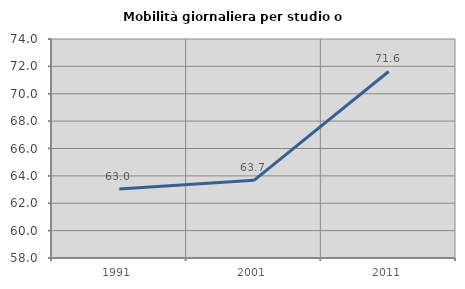
| Category | Mobilità giornaliera per studio o lavoro |
|---|---|
| 1991.0 | 63.05 |
| 2001.0 | 63.673 |
| 2011.0 | 71.628 |